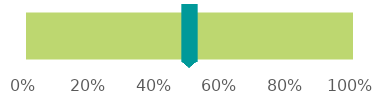
| Category | Series 0 | Measure | Identification of Alcohol and Other Drug Services |
|---|---|---|---|
| 0 |  | 0 | 1 |